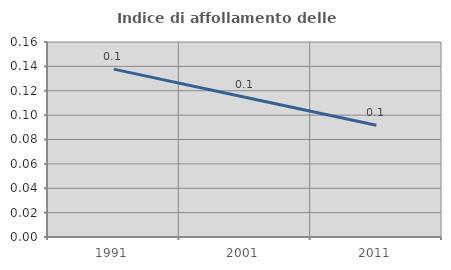
| Category | Indice di affollamento delle abitazioni  |
|---|---|
| 1991.0 | 0.138 |
| 2001.0 | 0.115 |
| 2011.0 | 0.092 |